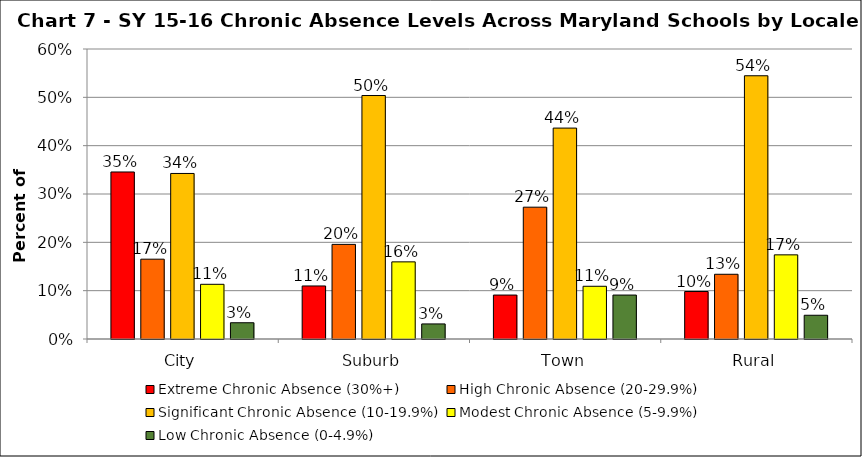
| Category | Extreme Chronic Absence (30%+) | High Chronic Absence (20-29.9%) | Significant Chronic Absence (10-19.9%) | Modest Chronic Absence (5-9.9%) | Low Chronic Absence (0-4.9%) |
|---|---|---|---|---|---|
| 0 | 0.346 | 0.165 | 0.343 | 0.113 | 0.034 |
| 1 | 0.11 | 0.196 | 0.504 | 0.16 | 0.031 |
| 2 | 0.091 | 0.273 | 0.436 | 0.109 | 0.091 |
| 3 | 0.098 | 0.134 | 0.545 | 0.174 | 0.049 |